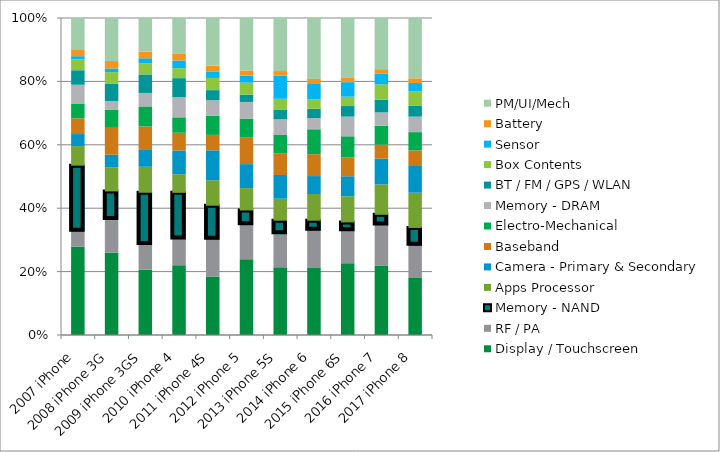
| Category | Display / Touchscreen  | RF / PA | Memory - NAND | Apps Processor | Camera - Primary & Secondary | Baseband | Electro-Mechanical | Memory - DRAM | BT / FM / GPS / WLAN | Box Contents | Sensor | Battery | PM/UI/Mech |
|---|---|---|---|---|---|---|---|---|---|---|---|---|---|
| 2007 iPhone | 64.2 | 11.01 | 48 | 14.25 | 8.75 | 11.45 | 10.432 | 14 | 10.534 | 7.99 | 2.252 | 5.05 | 22.735 |
| 2008 iPhone 3G | 46.1 | 18.019 | 16 | 13.5 | 7 | 15 | 9.999 | 5 | 9.513 | 6.585 | 2.085 | 4.1 | 24.02 |
| 2009 iPhone 3GS | 36.3 | 13.802 | 29 | 14.468 | 9.35 | 13.024 | 11.174 | 7.5 | 10.293 | 6.165 | 2.823 | 3.7 | 18.693 |
| 2010 iPhone 4 | 40.3 | 14.791 | 27 | 10.75 | 13.7 | 10.253 | 8.914 | 11.6 | 11.037 | 5.755 | 4.45 | 3.75 | 20.766 |
| 2011 iPhone 4S | 34.4 | 21.624 | 20 | 14.987 | 17.6 | 9.068 | 11.198 | 9.2 | 5.937 | 7.165 | 3.85 | 3.35 | 28.047 |
| 2012 iPhone 5 | 49.2 | 21.991 | 9.6 | 14.52 | 15.57 | 17.499 | 12.038 | 10.8 | 4.734 | 7.795 | 4.55 | 3.3 | 34.085 |
| 2013 iPhone 5S | 42.3 | 20.501 | 8.5 | 13.7 | 14.8 | 13.592 | 11.362 | 9.8 | 6.111 | 6.674 | 14.409 | 2.9 | 33.087 |
| 2014 iPhone 6 | 44.8 | 24.951 | 6.75 | 17.89 | 12 | 14.65 | 16.662 | 7.5 | 6.229 | 6.386 | 10.22 | 3.35 | 40.815 |
| 2015 iPhone 6S | 45.6 | 20.313 | 5.6 | 16.63 | 12.7 | 12 | 13.389 | 12.5 | 6.708 | 5.943 | 9.24 | 3.05 | 37.695 |
| 2016 iPhone 7 | 51.9 | 30.323 | 8 | 22.86 | 19.25 | 10.55 | 14.211 | 10 | 9.506 | 11.554 | 8.09 | 3.3 | 38.395 |
| 2017 iPhone 8 | 45 | 24.6 | 14 | 27.5 | 21.5 | 11.5 | 14.3 | 12.1 | 8.375 | 11.45 | 6.4 | 3.7 | 47.08 |